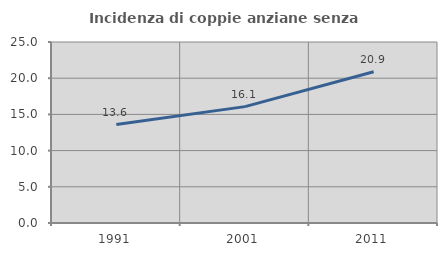
| Category | Incidenza di coppie anziane senza figli  |
|---|---|
| 1991.0 | 13.595 |
| 2001.0 | 16.075 |
| 2011.0 | 20.897 |